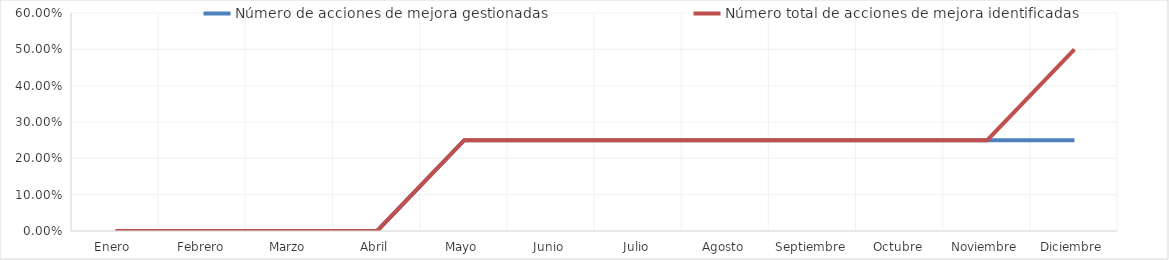
| Category | Número de acciones de mejora gestionadas | Número total de acciones de mejora identificadas |
|---|---|---|
| Enero  | 0 | 0 |
| Febrero | 0 | 0 |
| Marzo | 0 | 0 |
| Abril | 0 | 0 |
| Mayo | 0.25 | 0.25 |
| Junio | 0.25 | 0.25 |
| Julio | 0.25 | 0.25 |
| Agosto | 0.25 | 0.25 |
| Septiembre | 0.25 | 0.25 |
| Octubre | 0.25 | 0.25 |
| Noviembre | 0.25 | 0.25 |
| Diciembre | 0.25 | 0.5 |